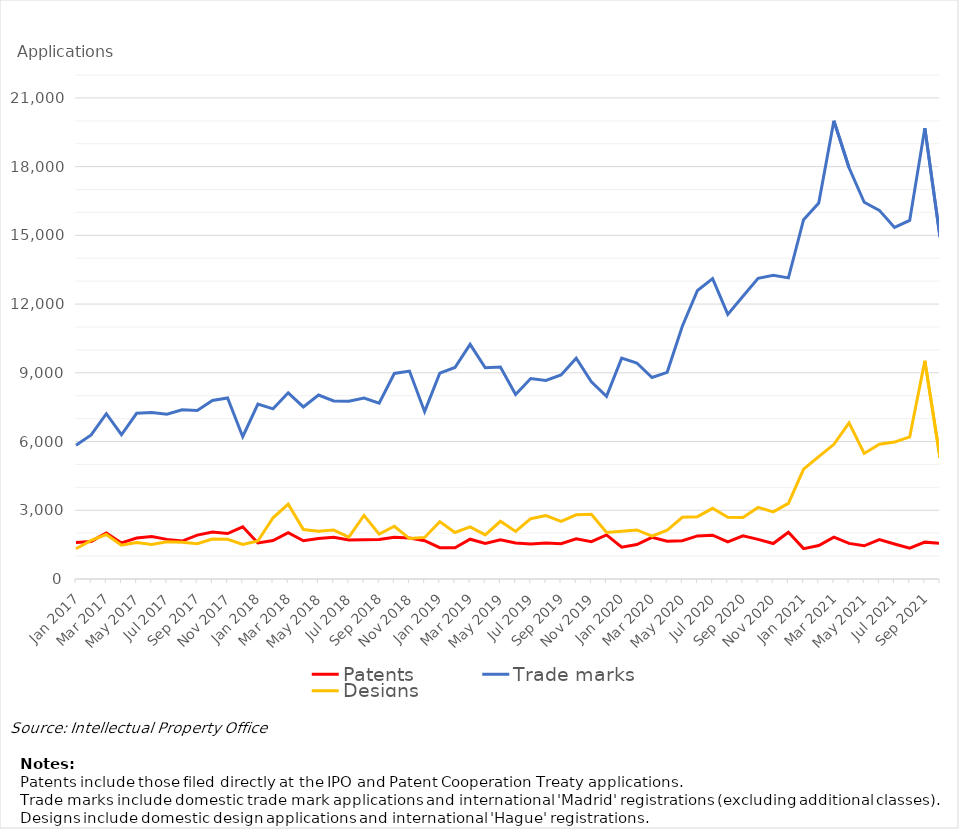
| Category | Patents | Trade marks | Designs |
|---|---|---|---|
| Jan 2017 | 1596 | 5843 | 1318 |
| Feb 2017 | 1640 | 6288 | 1687 |
| Mar 2017 | 2011 | 7214 | 1940 |
| Apr 2017 | 1573 | 6297 | 1474 |
| May 2017 | 1790 | 7234 | 1592 |
| Jun 2017 | 1853 | 7263 | 1502 |
| Jul 2017 | 1730 | 7197 | 1627 |
| Aug 2017 | 1657 | 7389 | 1600 |
| Sep 2017 | 1915 | 7359 | 1544 |
| Oct 2017 | 2055 | 7792 | 1745 |
| Nov 2017 | 1983 | 7901 | 1736 |
| Dec 2017 | 2277 | 6211 | 1507 |
| Jan 2018 | 1575 | 7634 | 1658 |
| Feb 2018 | 1676 | 7428 | 2672 |
| Mar 2018 | 2022 | 8127 | 3267 |
| Apr 2018 | 1670 | 7512 | 2160 |
| May 2018 | 1767 | 8030 | 2083 |
| Jun 2018 | 1821 | 7769 | 2136 |
| Jul 2018 | 1704 | 7757 | 1832 |
| Aug 2018 | 1713 | 7897 | 2777 |
| Sep 2018 | 1725 | 7673 | 1960 |
| Oct 2018 | 1818 | 8972 | 2302 |
| Nov 2018 | 1787 | 9076 | 1765 |
| Dec 2018 | 1670 | 7304 | 1815 |
| Jan 2019 | 1367 | 8984 | 2505 |
| Feb 2019 | 1361 | 9234 | 2031 |
| Mar 2019 | 1737 | 10243 | 2274 |
| Apr 2019 | 1552 | 9219 | 1923 |
| May 2019 | 1710 | 9251 | 2520 |
| Jun 2019 | 1569 | 8053 | 2074 |
| Jul 2019 | 1527 | 8752 | 2634 |
| Aug 2019 | 1571 | 8670 | 2768 |
| Sep 2019 | 1540 | 8907 | 2511 |
| Oct 2019 | 1755 | 9636 | 2800 |
| Nov 2019 | 1630 | 8607 | 2827 |
| Dec 2019 | 1926 | 7970 | 2028 |
| Jan 2020 | 1392 | 9642 | 2082 |
| Feb 2020 | 1506 | 9428 | 2143 |
| Mar 2020 | 1819 | 8794 | 1871 |
| Apr 2020 | 1648 | 9021 | 2127 |
| May 2020 | 1671 | 11035 | 2694 |
| Jun 2020 | 1880 | 12593 | 2721 |
| Jul 2020 | 1911 | 13110 | 3085 |
| Aug 2020 | 1616 | 11551 | 2694 |
| Sep 2020 | 1886 | 12340 | 2686 |
| Oct 2020 | 1731 | 13126 | 3124 |
| Nov 2020 | 1548 | 13254 | 2930 |
| Dec 2020 | 2043 | 13143 | 3303 |
| Jan 2021 | 1326 | 15685 | 4792 |
| Feb 2021 | 1463 | 16412 | 5341 |
| Mar 2021 | 1826 | 20001 | 5879 |
| Apr 2021 | 1554 | 17951 | 6814 |
| May 2021 | 1449 | 16446 | 5480 |
| Jun 2021 | 1718 | 16093 | 5880 |
| Jul 2021 | 1528 | 15345 | 5977 |
| Aug 2021 | 1348 | 15651 | 6200 |
| Sep 2021 | 1609 | 19681 | 9523 |
| Oct 2021 | 1555 | 14924 | 5287 |